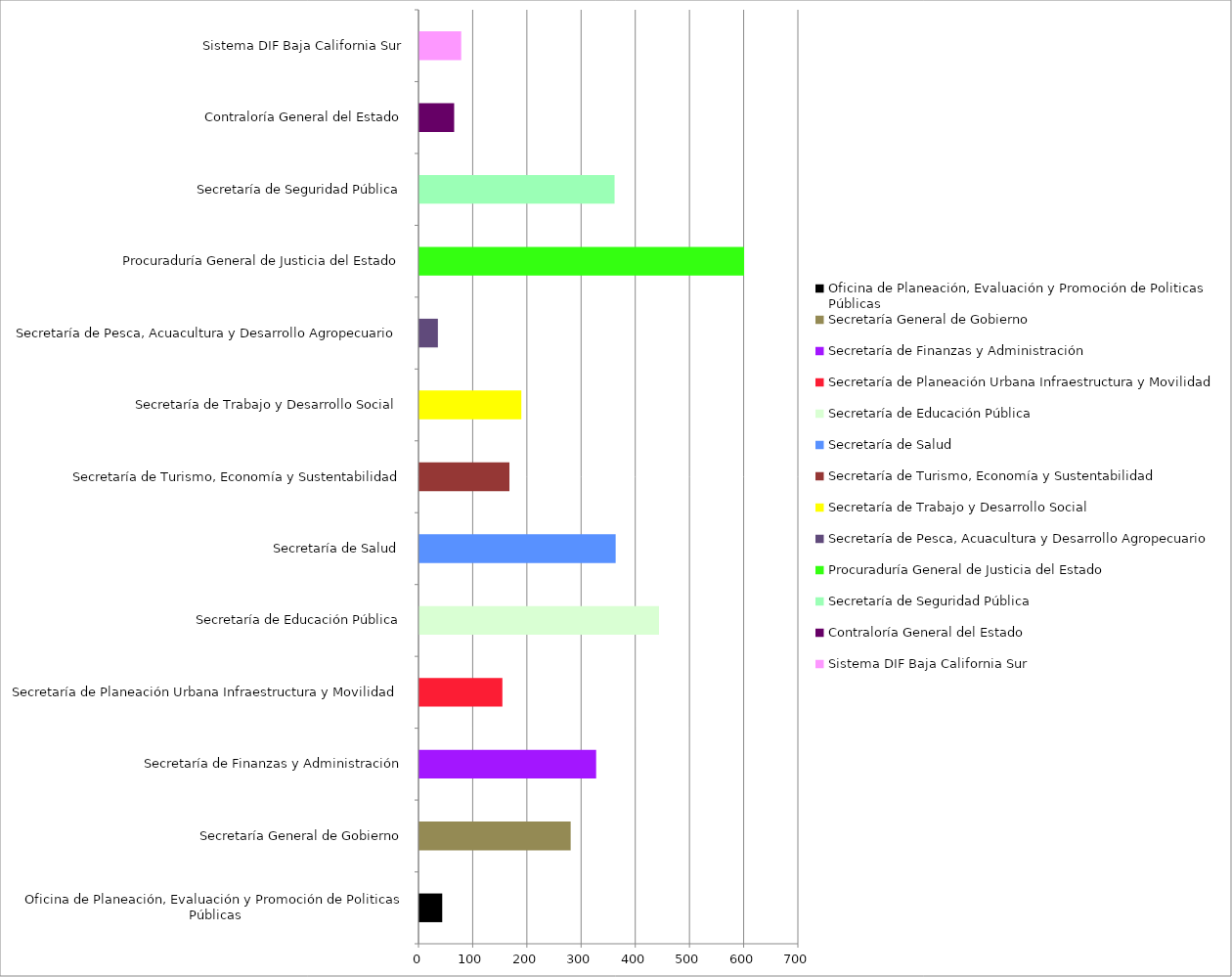
| Category | Series 0 |
|---|---|
| Oficina de Planeación, Evaluación y Promoción de Politicas Públicas | 42 |
| Secretaría General de Gobierno | 279 |
| Secretaría de Finanzas y Administración | 326 |
| Secretaría de Planeación Urbana Infraestructura y Movilidad | 153 |
| Secretaría de Educación Pública | 442 |
| Secretaría de Salud  | 362 |
| Secretaría de Turismo, Economía y Sustentabilidad | 166 |
| Secretaría de Trabajo y Desarrollo Social  | 188 |
| Secretaría de Pesca, Acuacultura y Desarrollo Agropecuario | 34 |
| Procuraduría General de Justicia del Estado | 599 |
| Secretaría de Seguridad Pública | 360 |
| Contraloría General del Estado | 64 |
| Sistema DIF Baja California Sur | 77 |